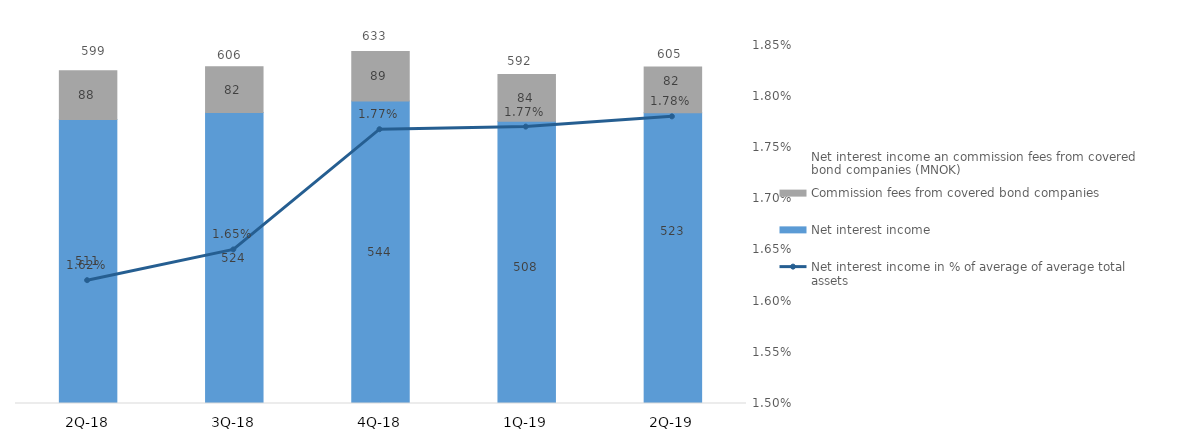
| Category | Net interest income | Commission fees from covered bond companies |
|---|---|---|
| 2Q-19 | 523.387 | 82.097 |
| 1Q-19 | 508 | 84.15 |
| 4Q-18 | 544.32 | 88.95 |
| 3Q-18 | 523.87 | 81.9 |
| 2Q-18 | 511.1 | 87.5 |